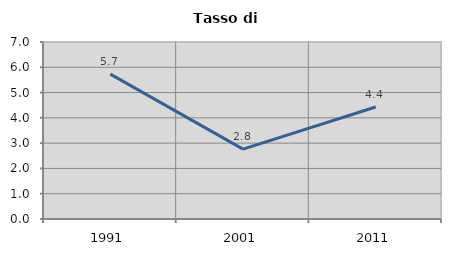
| Category | Tasso di disoccupazione   |
|---|---|
| 1991.0 | 5.728 |
| 2001.0 | 2.763 |
| 2011.0 | 4.43 |